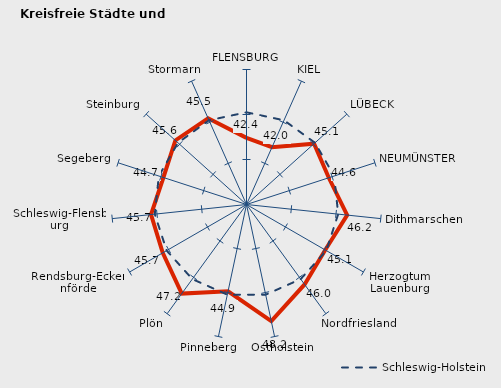
| Category | Kreise | Schleswig-Holstein |
|---|---|---|
| FLENSBURG | 42.405 | 45.243 |
| KIEL | 41.966 | 45.243 |
| LÜBECK | 45.101 | 45.243 |
| NEUMÜNSTER | 44.615 | 45.243 |
| Dithmarschen | 46.249 | 45.243 |
| Herzogtum Lauenburg | 45.098 | 45.243 |
| Nordfriesland | 45.981 | 45.243 |
| Ostholstein | 48.245 | 45.243 |
| Pinneberg | 44.852 | 45.243 |
| Plön | 47.233 | 45.243 |
| Rendsburg-Eckernförde | 45.748 | 45.243 |
| Schleswig-Flensburg | 45.666 | 45.243 |
| Segeberg | 44.708 | 45.243 |
| Steinburg | 45.636 | 45.243 |
| Stormarn | 45.481 | 45.243 |